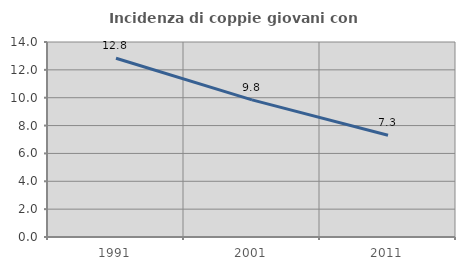
| Category | Incidenza di coppie giovani con figli |
|---|---|
| 1991.0 | 12.83 |
| 2001.0 | 9.846 |
| 2011.0 | 7.306 |